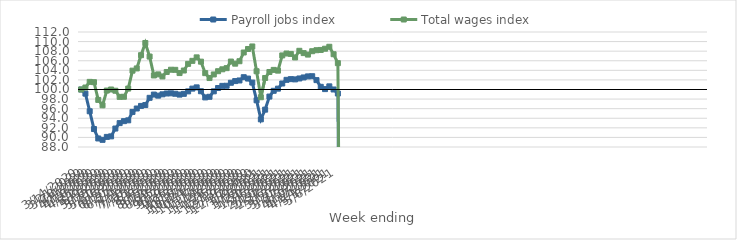
| Category | Payroll jobs index | Total wages index |
|---|---|---|
| 14/03/2020 | 100 | 100 |
| 21/03/2020 | 99.139 | 100.412 |
| 28/03/2020 | 95.457 | 101.592 |
| 04/04/2020 | 91.751 | 101.525 |
| 11/04/2020 | 89.781 | 97.831 |
| 18/04/2020 | 89.495 | 96.701 |
| 25/04/2020 | 90.108 | 99.778 |
| 02/05/2020 | 90.219 | 100.001 |
| 09/05/2020 | 91.853 | 99.744 |
| 16/05/2020 | 92.984 | 98.459 |
| 23/05/2020 | 93.397 | 98.481 |
| 30/05/2020 | 93.565 | 100.195 |
| 06/06/2020 | 95.317 | 103.933 |
| 13/06/2020 | 96.033 | 104.396 |
| 20/06/2020 | 96.573 | 107.162 |
| 27/06/2020 | 96.758 | 109.706 |
| 04/07/2020 | 98.265 | 106.875 |
| 11/07/2020 | 98.942 | 102.929 |
| 18/07/2020 | 98.719 | 103.154 |
| 25/07/2020 | 98.995 | 102.726 |
| 01/08/2020 | 99.171 | 103.657 |
| 08/08/2020 | 99.202 | 104.126 |
| 15/08/2020 | 99.11 | 104.104 |
| 22/08/2020 | 98.934 | 103.429 |
| 29/08/2020 | 99.096 | 103.959 |
| 05/09/2020 | 99.607 | 105.349 |
| 12/09/2020 | 100.183 | 105.978 |
| 19/09/2020 | 100.444 | 106.705 |
| 26/09/2020 | 99.637 | 105.812 |
| 03/10/2020 | 98.348 | 103.412 |
| 10/10/2020 | 98.477 | 102.392 |
| 17/10/2020 | 99.616 | 103.142 |
| 24/10/2020 | 100.308 | 103.817 |
| 31/10/2020 | 100.759 | 104.215 |
| 07/11/2020 | 100.782 | 104.455 |
| 14/11/2020 | 101.408 | 105.832 |
| 21/11/2020 | 101.758 | 105.392 |
| 28/11/2020 | 101.886 | 105.901 |
| 05/12/2020 | 102.568 | 107.718 |
| 12/12/2020 | 102.28 | 108.454 |
| 19/12/2020 | 101.444 | 108.982 |
| 26/12/2020 | 97.749 | 103.81 |
| 02/01/2021 | 93.77 | 98.383 |
| 09/01/2021 | 95.795 | 102.397 |
| 16/01/2021 | 98.524 | 103.654 |
| 23/01/2021 | 99.729 | 104.093 |
| 30/01/2021 | 100.177 | 103.936 |
| 06/02/2021 | 101.251 | 107.112 |
| 13/02/2021 | 102.017 | 107.511 |
| 20/02/2021 | 102.165 | 107.428 |
| 27/02/2021 | 102.113 | 106.69 |
| 06/03/2021 | 102.305 | 108.075 |
| 13/03/2021 | 102.515 | 107.597 |
| 20/03/2021 | 102.736 | 107.287 |
| 27/03/2021 | 102.773 | 107.991 |
| 03/04/2021 | 101.96 | 108.198 |
| 10/04/2021 | 100.558 | 108.256 |
| 17/04/2021 | 100.082 | 108.511 |
| 24/04/2021 | 100.656 | 108.918 |
| 01/05/2021 | 100.004 | 107.36 |
| 08/05/2021 | 99.159 | 105.5 |